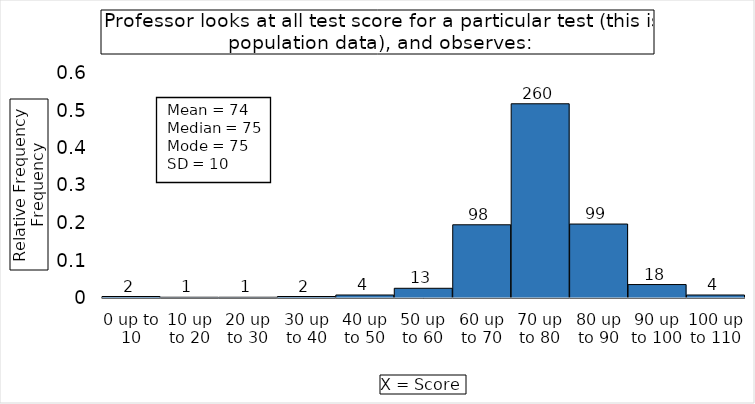
| Category | Relative Frequency
Frequency |
|---|---|
| 0 up to 10 | 0.004 |
| 10 up to 20 | 0.002 |
| 20 up to 30 | 0.002 |
| 30 up to 40 | 0.004 |
| 40 up to 50 | 0.008 |
| 50 up to 60 | 0.026 |
| 60 up to 70 | 0.195 |
| 70 up to 80 | 0.518 |
| 80 up to 90 | 0.197 |
| 90 up to 100 | 0.036 |
| 100 up to 110 | 0.008 |